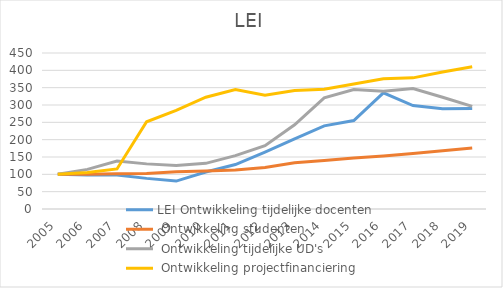
| Category | LEI |
|---|---|
| 2005.0 | 100 |
| 2006.0 | 105.263 |
| 2007.0 | 115.579 |
| 2008.0 | 251.579 |
| 2009.0 | 284.632 |
| 2010.0 | 322.526 |
| 2011.0 | 344.421 |
| 2012.0 | 328.211 |
| 2013.0 | 342.105 |
| 2014.0 | 345.474 |
| 2015.0 | 360.842 |
| 2016.0 | 376 |
| 2017.0 | 378.316 |
| 2018.0 | 394.947 |
| 2019.0 | 410.316 |